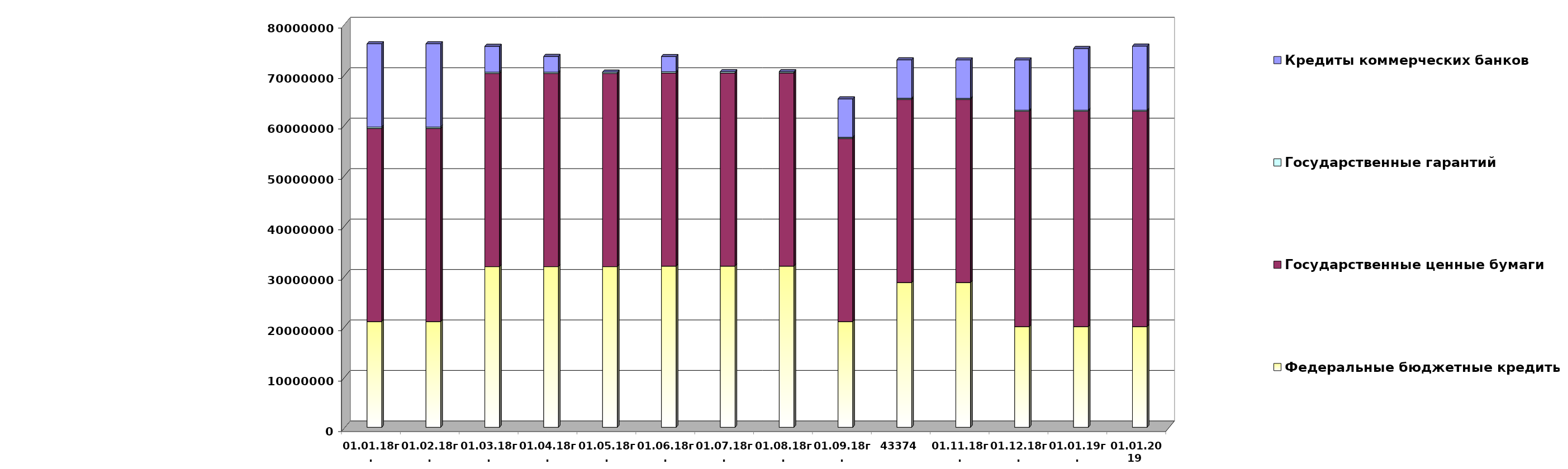
| Category | Федеральные бюджетные кредиты | Государственные ценные бумаги  | Государственные гарантий | Кредиты коммерческих банков |
|---|---|---|---|---|
| 01.01.18г. | 20959084.963 | 38300000 | 267412.82 | 16500000 |
| 01.02.18г. | 20959084.963 | 38300000 | 262100.52 | 16500000 |
| 01.03.18г. | 31846902.963 | 38300000 | 262100.52 | 5112182 |
| 01.04.18г. | 31846902.963 | 38300000 | 262100.52 | 3112182 |
| 01.05.18г. | 31846902.963 | 38300000 | 253223.16 | 0 |
| 01.06.18г. | 31945227.963 | 38300000 | 253223.16 | 3000000 |
| 01.07.18г. | 31945227.963 | 38300000 | 253223.16 | 0 |
| 01.08.18г. | 31945227.963 | 38300000 | 232477.01 | 0 |
| 01.09.18г. | 20959084.963 | 36300000 | 232477.01 | 7612182 |
| 43374 | 28702553.563 | 36300000 | 232477.01 | 7612182 |
| 01.11.18г. | 28702553.563 | 36300000 | 209872.86 | 7612182 |
| 01.12.18г. | 19957026.213 | 42700000 | 209872.86 | 9957709.35 |
| 01.01.19г. | 19957026.213 | 42700000 | 209872.86 | 12219963.75 |
| 01.01.2019 
(прогноз) | 19957026.2 | 42700000 | 209872.8 | 12690101.4 |